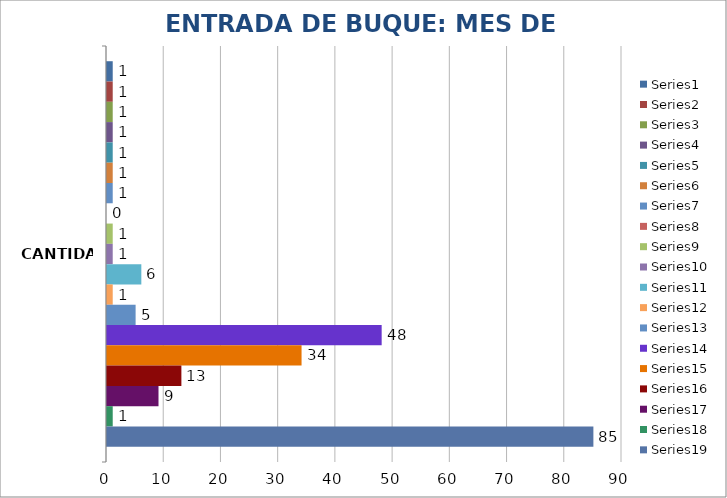
| Category | Series 0 | Series 1 | Series 2 | Series 3 | Series 4 | Series 5 | Series 6 | Series 7 | Series 8 | Series 9 | Series 10 | Series 11 | Series 12 | Series 13 | Series 14 | Series 15 | Series 16 | Series 17 | Series 18 |
|---|---|---|---|---|---|---|---|---|---|---|---|---|---|---|---|---|---|---|---|
| CANTIDAD | 1 | 1 | 1 | 1 | 1 | 1 | 1 | 0 | 1 | 1 | 6 | 1 | 5 | 48 | 34 | 13 | 9 | 1 | 85 |